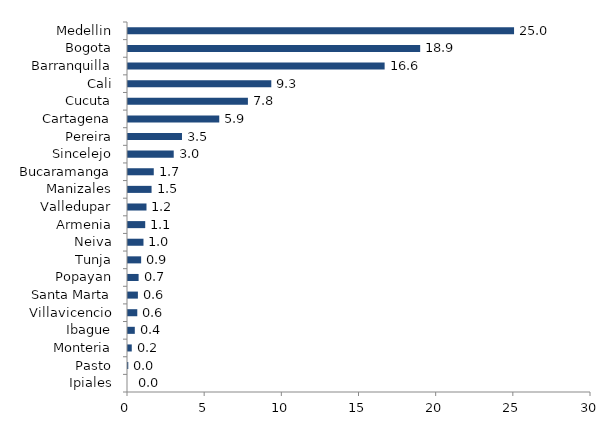
| Category | Series 0 |
|---|---|
| Ipiales | 0 |
| Pasto | 0.018 |
| Monteria | 0.244 |
| Ibague | 0.441 |
| Villavicencio | 0.602 |
| Santa Marta | 0.641 |
| Popayan | 0.687 |
| Tunja | 0.851 |
| Neiva | 1.003 |
| Armenia | 1.115 |
| Valledupar | 1.198 |
| Manizales | 1.527 |
| Bucaramanga | 1.67 |
| Sincelejo | 2.963 |
| Pereira | 3.498 |
| Cartagena | 5.913 |
| Cucuta | 7.77 |
| Cali | 9.285 |
| Barranquilla | 16.629 |
| Bogota | 18.931 |
| Medellin | 25.014 |